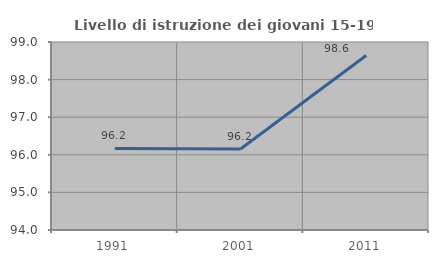
| Category | Livello di istruzione dei giovani 15-19 anni |
|---|---|
| 1991.0 | 96.169 |
| 2001.0 | 96.154 |
| 2011.0 | 98.643 |